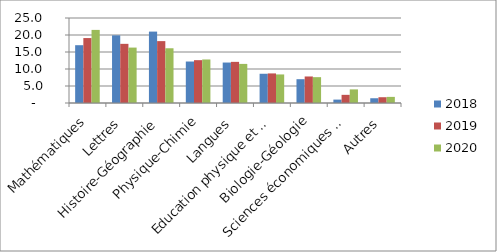
| Category | 2018 | 2019 | 2020 |
|---|---|---|---|
| Mathématiques | 17 | 19.1 | 21.5 |
| Lettres | 19.9 | 17.4 | 16.3 |
| Histoire-Géographie | 21 | 18.2 | 16.1 |
| Physique-Chimie | 12.2 | 12.6 | 12.8 |
| Langues | 11.9 | 12.1 | 11.5 |
| Education physique et sportive | 8.6 | 8.7 | 8.4 |
| Biologie-Géologie | 7 | 7.8 | 7.6 |
| Sciences économiques et sociales | 1 | 2.4 | 4 |
| Autres | 1.4 | 1.7 | 1.8 |